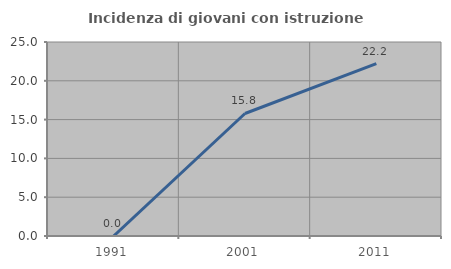
| Category | Incidenza di giovani con istruzione universitaria |
|---|---|
| 1991.0 | 0 |
| 2001.0 | 15.789 |
| 2011.0 | 22.222 |